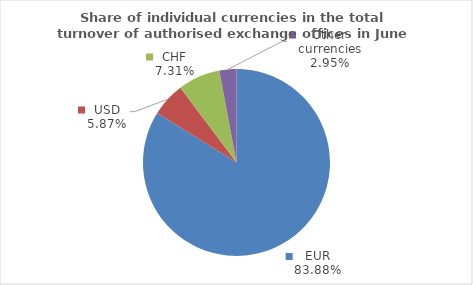
| Category | Series 0 |
|---|---|
| EUR | 83.88 |
| USD | 5.868 |
| CHF | 7.302 |
| Other currencies | 2.95 |